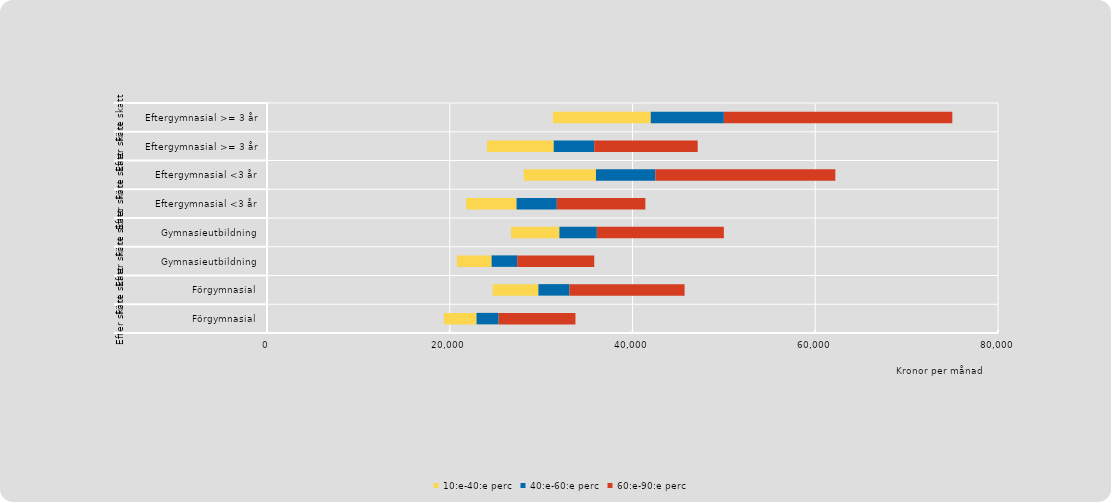
| Category | Series 0 | 10:e-40:e perc | 40:e-60:e perc | 60:e-90:e perc |
|---|---|---|---|---|
| 0 | 19353 | 3581 | 2414 | 8410 |
| 1 | 24700 | 5000 | 3400 | 12600 |
| 2 | 20785 | 3797 | 2799 | 8430 |
| 3 | 26700 | 5300 | 4100 | 13900 |
| 4 | 21788 | 5525 | 4405 | 9689 |
| 5 | 28100 | 7900 | 6500 | 19700 |
| 6 | 24080 | 7299 | 4432 | 11325 |
| 7 | 31300 | 10700 | 8000 | 25000 |